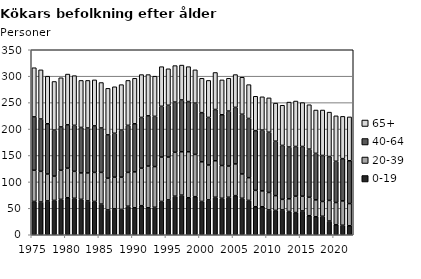
| Category | 0-19 | 20-39 | 40-64 | 65+ |
|---|---|---|---|---|
| 1975.0 | 63 | 59 | 101 | 93 |
| 1976.0 | 62 | 58 | 99 | 93 |
| 1977.0 | 64 | 51 | 95 | 90 |
| 1978.0 | 65 | 46 | 87 | 92 |
| 1979.0 | 67 | 55 | 82 | 93 |
| 1980.0 | 70 | 56 | 82 | 96 |
| 1981.0 | 69 | 51 | 87 | 94 |
| 1982.0 | 67 | 50 | 86 | 89 |
| 1983.0 | 64 | 53 | 85 | 90 |
| 1984.0 | 63 | 55 | 88 | 87 |
| 1985.0 | 58 | 60 | 84 | 86 |
| 1986.0 | 47 | 60 | 82 | 88 |
| 1987.0 | 49 | 60 | 83 | 88 |
| 1988.0 | 48 | 61 | 89 | 86 |
| 1989.0 | 54 | 64 | 89 | 85 |
| 1990.0 | 51 | 68 | 91 | 86 |
| 1991.0 | 55 | 71 | 96 | 81 |
| 1992.0 | 51 | 79 | 95 | 78 |
| 1993.0 | 52 | 77 | 95 | 76 |
| 1994.0 | 63 | 84 | 96 | 75 |
| 1995.0 | 66 | 81 | 98 | 69 |
| 1996.0 | 73 | 83 | 95 | 69 |
| 1997.0 | 75 | 82 | 98 | 66 |
| 1998.0 | 70 | 87 | 95 | 66 |
| 1999.0 | 72 | 80 | 97 | 63 |
| 2000.0 | 63 | 75 | 93 | 65 |
| 2001.0 | 66 | 66 | 90 | 70 |
| 2002.0 | 71 | 69 | 97 | 70 |
| 2003.0 | 69 | 62 | 96 | 66 |
| 2004.0 | 71 | 59 | 104 | 62 |
| 2005.0 | 74 | 60 | 107 | 62 |
| 2006.0 | 69 | 46 | 113 | 70 |
| 2007.0 | 65 | 43 | 112 | 64 |
| 2008.0 | 53 | 31 | 113 | 65 |
| 2009.0 | 53 | 30 | 115 | 63 |
| 2010.0 | 47 | 33 | 114 | 65 |
| 2011.0 | 46 | 28 | 103 | 72 |
| 2012.0 | 47 | 20 | 102 | 76 |
| 2013.0 | 44 | 24 | 98 | 85 |
| 2014.0 | 42 | 31 | 94 | 86 |
| 2015.0 | 45 | 28 | 94 | 83 |
| 2016.0 | 36 | 35 | 91 | 84 |
| 2017.0 | 34 | 32 | 88 | 82 |
| 2018.0 | 35 | 28 | 87 | 86 |
| 2019.0 | 26 | 39 | 83 | 84 |
| 2020.0 | 19 | 42 | 78 | 86 |
| 2021.0 | 18 | 46 | 80 | 80 |
| 2022.0 | 17 | 42 | 81 | 83 |